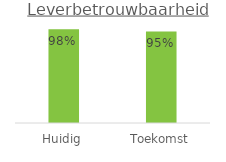
| Category | Leverbetrouwbaarheid |
|---|---|
| Huidig | 0.977 |
| Toekomst | 0.954 |